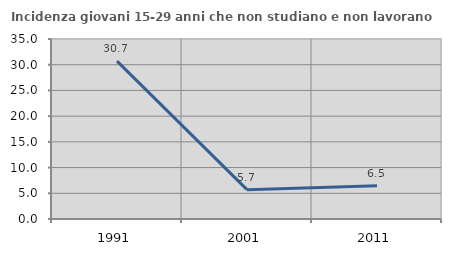
| Category | Incidenza giovani 15-29 anni che non studiano e non lavorano  |
|---|---|
| 1991.0 | 30.702 |
| 2001.0 | 5.704 |
| 2011.0 | 6.485 |